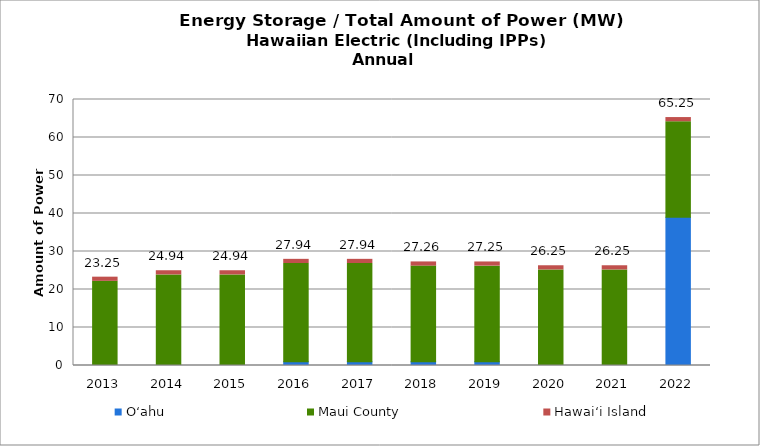
| Category | O‘ahu | Maui County | Hawai‘i Island |
|---|---|---|---|
| 2013.0 | 0.006 | 22.141 | 1.1 |
| 2014.0 | 0.006 | 23.831 | 1.1 |
| 2015.0 | 0.006 | 23.831 | 1.1 |
| 2016.0 | 1.006 | 25.831 | 1.1 |
| 2017.0 | 1.006 | 25.831 | 1.1 |
| 2018.0 | 1.014 | 25.141 | 1.1 |
| 2019.0 | 1.006 | 25.141 | 1.1 |
| 2020.0 | 0.006 | 25.141 | 1.1 |
| 2021.0 | 0.006 | 25.141 | 1.1 |
| 2022.0 | 39.006 | 25.141 | 1.1 |